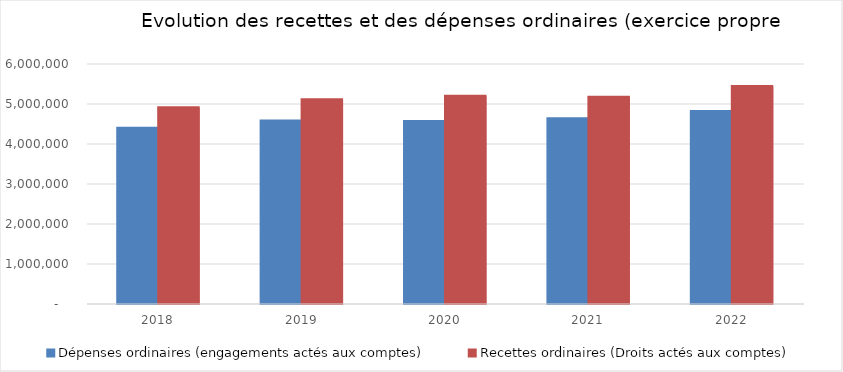
| Category | Dépenses ordinaires (engagements actés aux comptes) | Recettes ordinaires (Droits actés aux comptes) |
|---|---|---|
| 2018.0 | 4395057.88 | 4906932.63 |
| 2019.0 | 4576475.19 | 5105229.57 |
| 2020.0 | 4561246.85 | 5194338.9 |
| 2021.0 | 4631643.31 | 5168046.38 |
| 2022.0 | 4811976.97 | 5435506.07 |